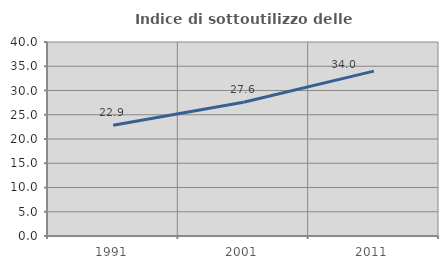
| Category | Indice di sottoutilizzo delle abitazioni  |
|---|---|
| 1991.0 | 22.853 |
| 2001.0 | 27.577 |
| 2011.0 | 33.998 |